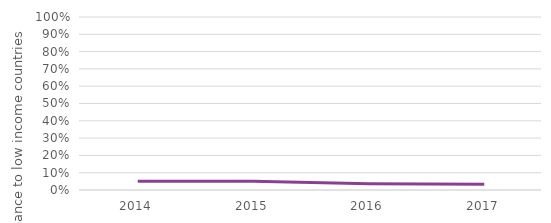
| Category | Low income |
|---|---|
| 2014.0 | 0.051 |
| 2015.0 | 0.051 |
| 2016.0 | 0.037 |
| 2017.0 | 0.034 |